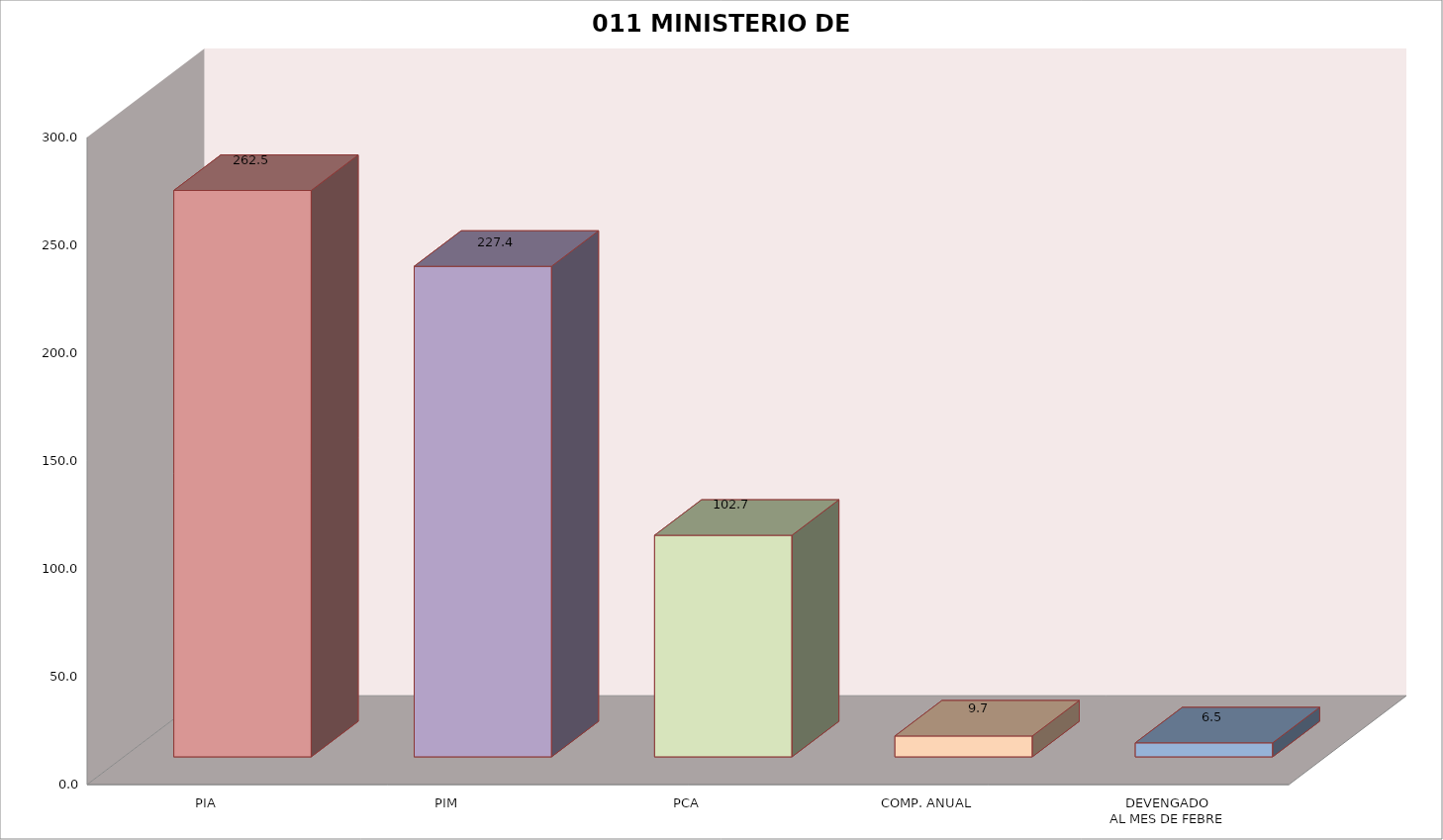
| Category | 011 MINISTERIO DE SALUD |
|---|---|
| PIA | 262.508 |
| PIM | 227.351 |
| PCA | 102.685 |
| COMP. ANUAL | 9.653 |
| DEVENGADO
AL MES DE FEBRE | 6.483 |